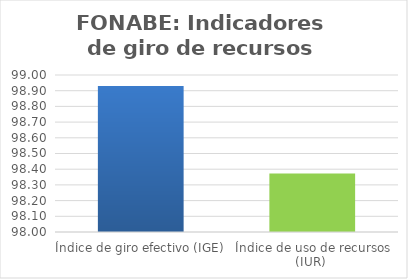
| Category | Series 0 |
|---|---|
| Índice de giro efectivo (IGE) | 98.93 |
| Índice de uso de recursos (IUR)  | 98.372 |